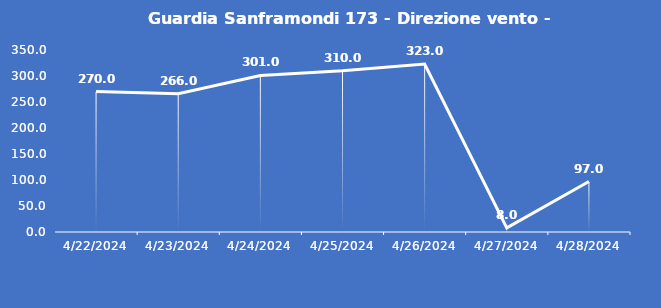
| Category | Guardia Sanframondi 173 - Direzione vento - Grezzo (°N) |
|---|---|
| 4/22/24 | 270 |
| 4/23/24 | 266 |
| 4/24/24 | 301 |
| 4/25/24 | 310 |
| 4/26/24 | 323 |
| 4/27/24 | 8 |
| 4/28/24 | 97 |